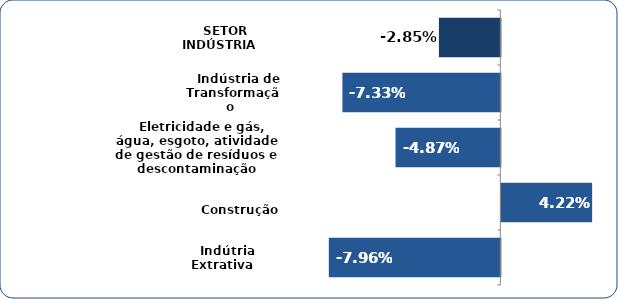
| Category | Series 0 |
|---|---|
|    Indútria Extrativa | -0.08 |
|    Construção | 0.042 |
|    Eletricidade e gás, água, esgoto, atividade de gestão de resíduos e descontaminação | -0.049 |
|    Indústria de Transformação  | -0.073 |
|    SETOR INDÚSTRIA | -0.029 |